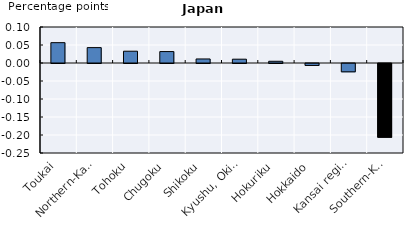
| Category | Series 0 | Series 1 | Series 2 | Series 3 |
|---|---|---|---|---|
| Toukai | 0 | 0.056 | 0 | 0 |
| Northern-Kanto, Koshin | 0 | 0.043 | 0 | 0 |
| Tohoku | 0 | 0.033 | 0 | 0 |
| Chugoku | 0 | 0.032 | 0 | 0 |
| Shikoku | 0 | 0.011 | 0 | 0 |
| Kyushu, Okinawa | 0 | 0.011 | 0 | 0 |
| Hokuriku | 0 | 0.005 | 0 | 0 |
| Hokkaido | 0 | -0.005 | 0 | 0 |
| Kansai region | 0 | -0.023 | 0 | 0 |
| Southern-Kanto | -0.205 | 0 | 0 | 0 |